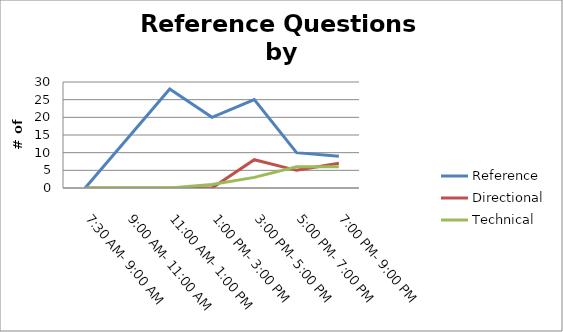
| Category | Reference | Directional | Technical |
|---|---|---|---|
| 7:30 AM- 9:00 AM | 0 | 0 | 0 |
| 9:00 AM- 11:00 AM | 14 | 0 | 0 |
| 11:00 AM- 1:00 PM | 28 | 0 | 0 |
| 1:00 PM- 3:00 PM | 20 | 0 | 1 |
| 3:00 PM- 5:00 PM | 25 | 8 | 3 |
| 5:00 PM- 7:00 PM | 10 | 5 | 6 |
| 7:00 PM- 9:00 PM | 9 | 7 | 6 |